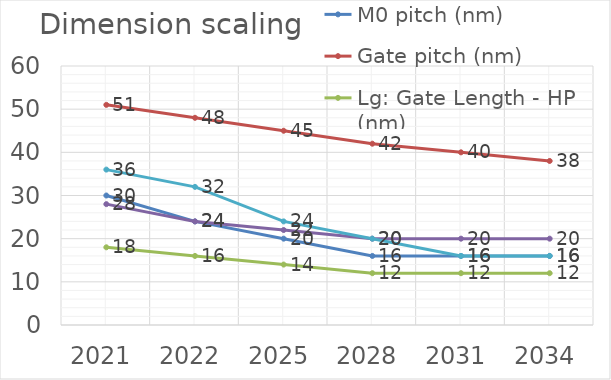
| Category | M0 pitch (nm) | Gate pitch (nm) | Lg: Gate Length - HP (nm) | Device lateral pitch (nm) | Mx pitch (nm) |
|---|---|---|---|---|---|
| 2021.0 | 30 | 51 | 18 | 28 | 36 |
| 2022.0 | 24 | 48 | 16 | 24 | 32 |
| 2025.0 | 20 | 45 | 14 | 22 | 24 |
| 2028.0 | 16 | 42 | 12 | 20 | 20 |
| 2031.0 | 16 | 40 | 12 | 20 | 16 |
| 2034.0 | 16 | 38 | 12 | 20 | 16 |